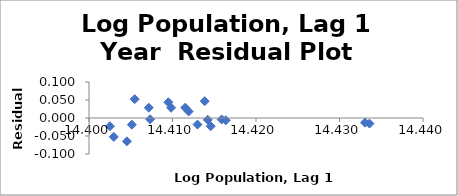
| Category | Series 0 |
|---|---|
| 14.412993946206358 | -0.018 |
| 14.414578350984256 | -0.023 |
| 14.416377962404924 | -0.006 |
| 14.415888727214549 | -0.004 |
| 14.413859577615845 | 0.047 |
| 14.411931506591158 | 0.018 |
| 14.409830832279873 | 0.028 |
| 14.407157540022864 | 0.029 |
| 14.402509134628643 | -0.023 |
| 14.402969947095297 | -0.052 |
| 14.40453978390092 | -0.065 |
| 14.40512998677255 | -0.019 |
| 14.405472632723393 | 0.052 |
| 14.40730971758726 | -0.003 |
| 14.409499062750108 | 0.044 |
| 14.411526050781111 | 0.029 |
| 14.414224524073347 | -0.005 |
| 14.433054495163342 | -0.013 |
| 14.433591461188882 | -0.015 |